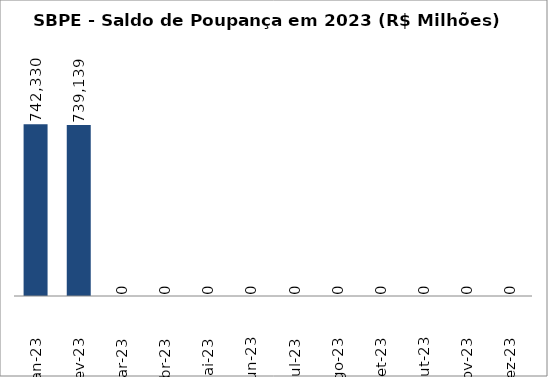
| Category | SBPE - Saldo de Poupança em 2023 (R$ Milhões) |
|---|---|
| Jan-23 | 742330.202 |
| Fev-23 | 739139.471 |
| Mar-23 | 0 |
| Abr-23 | 0 |
| Mai-23 | 0 |
| Jun-23 | 0 |
| Jul-23 | 0 |
| Ago-23 | 0 |
| Set-23 | 0 |
| Out-23 | 0 |
| Nov-23 | 0 |
| Dez-23 | 0 |